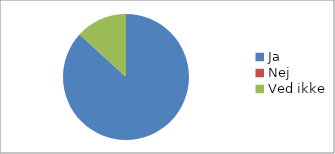
| Category | Vil du anbefale din virksomhed at deltage i arrangementet fremadrettet? (n=38) |
|---|---|
| Ja | 0.868 |
| Nej | 0 |
| Ved ikke | 0.132 |